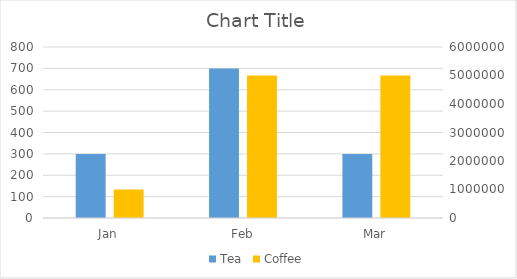
| Category | Tea | Pad Tea |
|---|---|---|
| Jan | 300 |  |
| Feb | 700 |  |
| Mar | 300 |  |